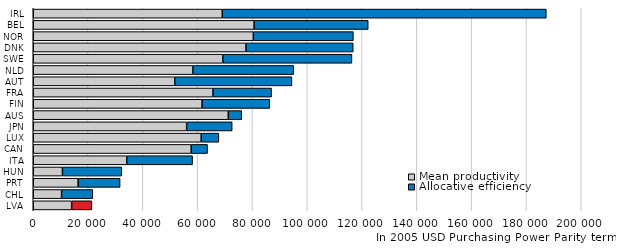
| Category | Mean productivity | Allocative efficiency |
|---|---|---|
| LVA | 14007.896 | 7388.565 |
| CHL | 10332.23 | 11416.78 |
| PRT | 16380.46 | 15319.77 |
| HUN | 10647.12 | 21675.01 |
| ITA | 34121.37 | 24027.91 |
| CAN | 57642.25 | 5977.723 |
| LUX | 61294.8 | 6447.915 |
| JPN | 55973.59 | 16628.83 |
| AUS | 71180.23 | 4896.695 |
| FIN | 61625.09 | 24710.59 |
| FRA | 65599.11 | 21380.05 |
| AUT | 51640.46 | 42768.23 |
| NLD | 58234.98 | 36811.99 |
| SWE | 69166.64 | 47146.53 |
| DNK | 77631.74 | 39152.62 |
| NOR | 80326.51 | 36506.58 |
| BEL | 80615.23 | 41632.76 |
| IRL | 68995 | 118257 |